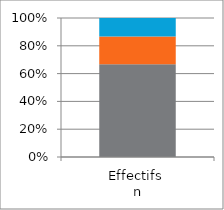
| Category | [ 30 - 35 [ | [ 35 - 40 [ | [ 40 - 45 [ |
|---|---|---|---|
| Effectifs 
n | 10 | 3 | 2 |